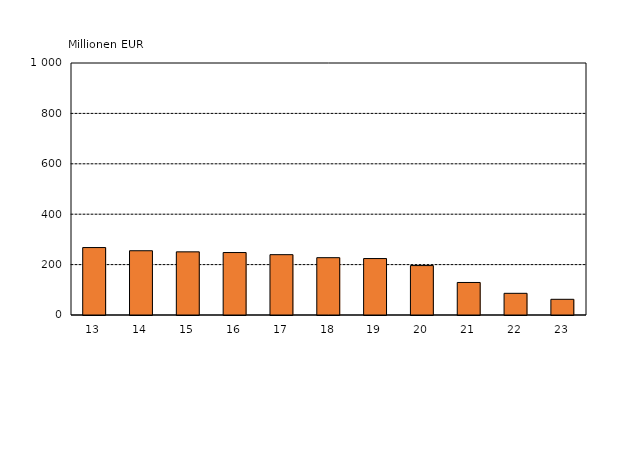
| Category | Series 0 |
|---|---|
| 13 | 267.653 |
| 14 | 254.984 |
| 15 | 250.563 |
| 16 | 247.864 |
| 17 | 239.451 |
| 18 | 227.452 |
| 19 | 224.003 |
| 20 | 196.151 |
| 21 | 129.068 |
| 22 | 86.044 |
| 23 | 62.274 |